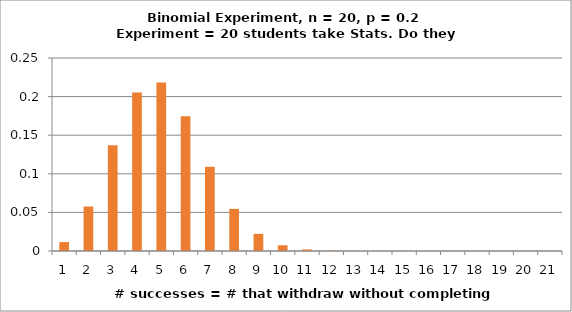
| Category | p(x) |
|---|---|
| 0 | 0.012 |
| 1 | 0.058 |
| 2 | 0.137 |
| 3 | 0.205 |
| 4 | 0.218 |
| 5 | 0.175 |
| 6 | 0.109 |
| 7 | 0.055 |
| 8 | 0.022 |
| 9 | 0.007 |
| 10 | 0.002 |
| 11 | 0 |
| 12 | 0 |
| 13 | 0 |
| 14 | 0 |
| 15 | 0 |
| 16 | 0 |
| 17 | 0 |
| 18 | 0 |
| 19 | 0 |
| 20 | 0 |